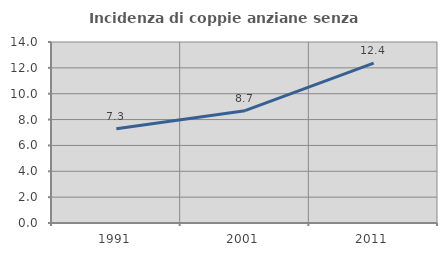
| Category | Incidenza di coppie anziane senza figli  |
|---|---|
| 1991.0 | 7.289 |
| 2001.0 | 8.687 |
| 2011.0 | 12.364 |